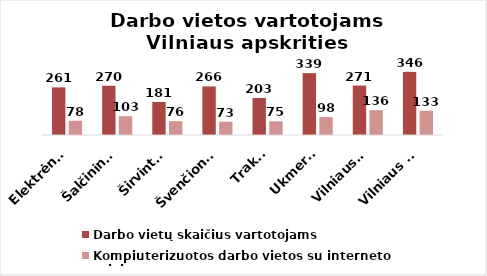
| Category | Darbo vietų skaičius vartotojams | Kompiuterizuotos darbo vietos su interneto prieiga |
|---|---|---|
| Elektrėnai | 261 | 78 |
| Šalčininkai | 270 | 103 |
| Širvintos | 181 | 76 |
| Švenčionys | 266 | 73 |
| Trakai | 203 | 75 |
| Ukmergė | 339 | 98 |
| Vilniaus r. | 271 | 136 |
| Vilniaus m. | 346 | 133 |